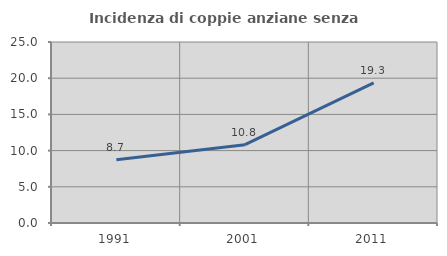
| Category | Incidenza di coppie anziane senza figli  |
|---|---|
| 1991.0 | 8.732 |
| 2001.0 | 10.813 |
| 2011.0 | 19.344 |